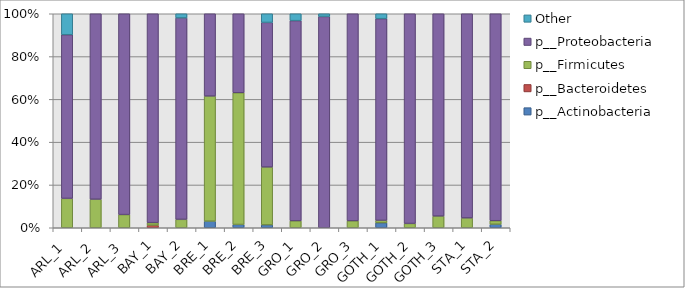
| Category | p__Actinobacteria | p__Bacteroidetes | p__Firmicutes | p__Proteobacteria | Other |
|---|---|---|---|---|---|
| ARL_1 | 0 | 0 | 0.14 | 0.78 | 0.1 |
| ARL_2 | 0 | 0 | 0.133 | 0.867 | 0 |
| ARL_3 | 0 | 0 | 0.062 | 0.938 | 0 |
| BAY_1 | 0 | 0.012 | 0.012 | 0.976 | 0 |
| BAY_2 | 0 | 0 | 0.039 | 0.941 | 0.02 |
| BRE_1 | 0.031 | 0 | 0.585 | 0.385 | 0 |
| BRE_2 | 0.015 | 0 | 0.615 | 0.369 | 0 |
| BRE_3 | 0.014 | 0 | 0.27 | 0.676 | 0.041 |
| GRO_1 | 0 | 0 | 0.033 | 0.956 | 0.033 |
| GRO_2 | 0 | 0 | 0 | 1 | 0.013 |
| GRO_3 | 0 | 0 | 0.032 | 0.968 | 0 |
| GOTH_1 | 0.024 | 0 | 0.012 | 0.965 | 0.024 |
| GOTH_2 | 0 | 0 | 0.02 | 0.98 | 0 |
| GOTH_3 | 0 | 0 | 0.055 | 0.945 | 0 |
| STA_1 | 0 | 0 | 0.046 | 0.954 | 0 |
| STA_2 | 0.016 | 0 | 0.016 | 0.967 | 0 |